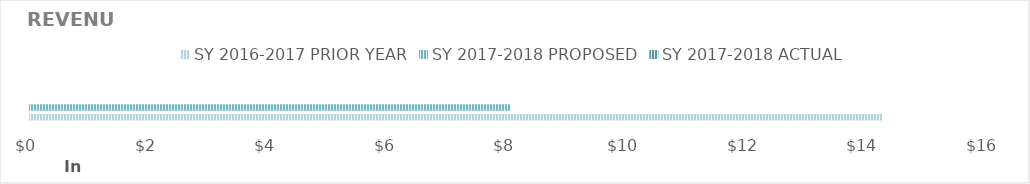
| Category | SY 2016-2017 | SY 2017-2018 |
|---|---|---|
| 0 | 14281.75 | 0 |